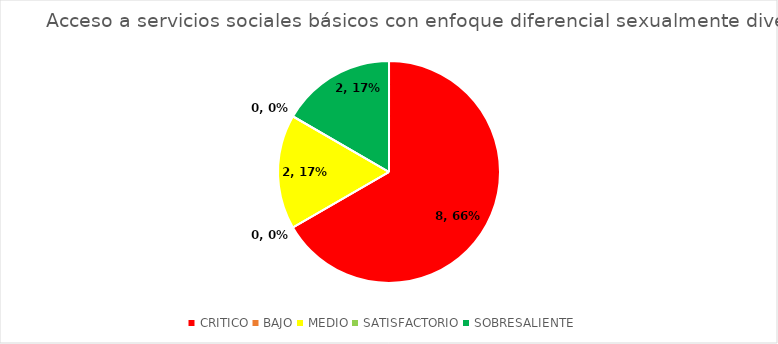
| Category | Acceso a servicios sociales básicos con enfoque diferencial sexualmente diverso |
|---|---|
| CRITICO | 8 |
| BAJO | 0 |
| MEDIO | 2 |
| SATISFACTORIO | 0 |
| SOBRESALIENTE | 2 |